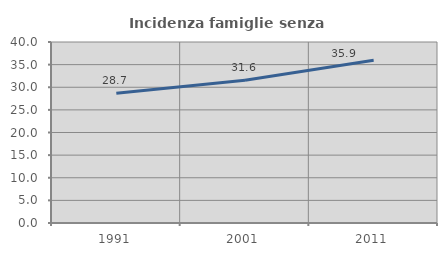
| Category | Incidenza famiglie senza nuclei |
|---|---|
| 1991.0 | 28.676 |
| 2001.0 | 31.568 |
| 2011.0 | 35.949 |